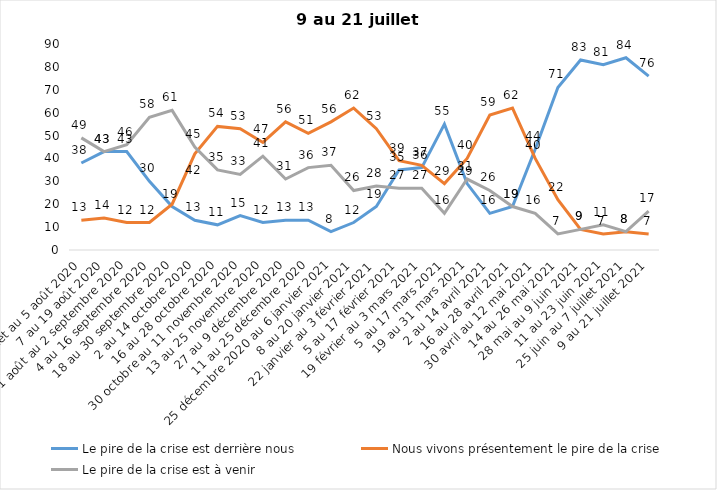
| Category | Le pire de la crise est derrière nous | Nous vivons présentement le pire de la crise | Le pire de la crise est à venir |
|---|---|---|---|
| 24 juillet au 5 août 2020 | 38 | 13 | 49 |
| 7 au 19 août 2020 | 43 | 14 | 43 |
| 21 août au 2 septembre 2020 | 43 | 12 | 46 |
| 4 au 16 septembre 2020 | 30 | 12 | 58 |
| 18 au 30 septembre 2020 | 19 | 20 | 61 |
| 2 au 14 octobre 2020 | 13 | 42 | 45 |
| 16 au 28 octobre 2020 | 11 | 54 | 35 |
| 30 octobre au 11 novembre 2020 | 15 | 53 | 33 |
| 13 au 25 novembre 2020 | 12 | 47 | 41 |
| 27 au 9 décembre 2020 | 13 | 56 | 31 |
| 11 au 25 décembre 2020 | 13 | 51 | 36 |
| 25 décembre 2020 au 6 janvier 2021 | 8 | 56 | 37 |
| 8 au 20 janvier 2021 | 12 | 62 | 26 |
| 22 janvier au 3 février 2021 | 19 | 53 | 28 |
| 5 au 17 février 2021 | 35 | 39 | 27 |
| 19 février au 3 mars 2021 | 36 | 37 | 27 |
| 5 au 17 mars 2021 | 55 | 29 | 16 |
| 19 au 31 mars 2021 | 29 | 40 | 31 |
| 2 au 14 avril 2021 | 16 | 59 | 26 |
| 16 au 28 avril 2021 | 19 | 62 | 19 |
| 30 avril au 12 mai 2021 | 44 | 40 | 16 |
| 14 au 26 mai 2021 | 71 | 22 | 7 |
| 28 mai au 9 juin 2021 | 83 | 9 | 9 |
| 11 au 23 juin 2021 | 81 | 7 | 11 |
| 25 juin au 7 juillet 2021 | 84 | 8 | 8 |
| 9 au 21 juillet 2021 | 76 | 7 | 17 |